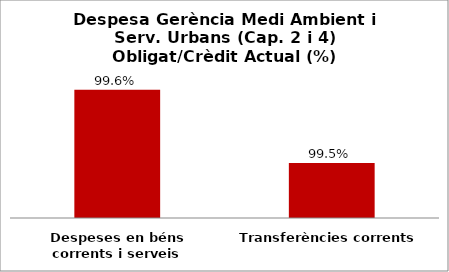
| Category | Series 0 |
|---|---|
| Despeses en béns corrents i serveis | 0.996 |
| Transferències corrents | 0.995 |